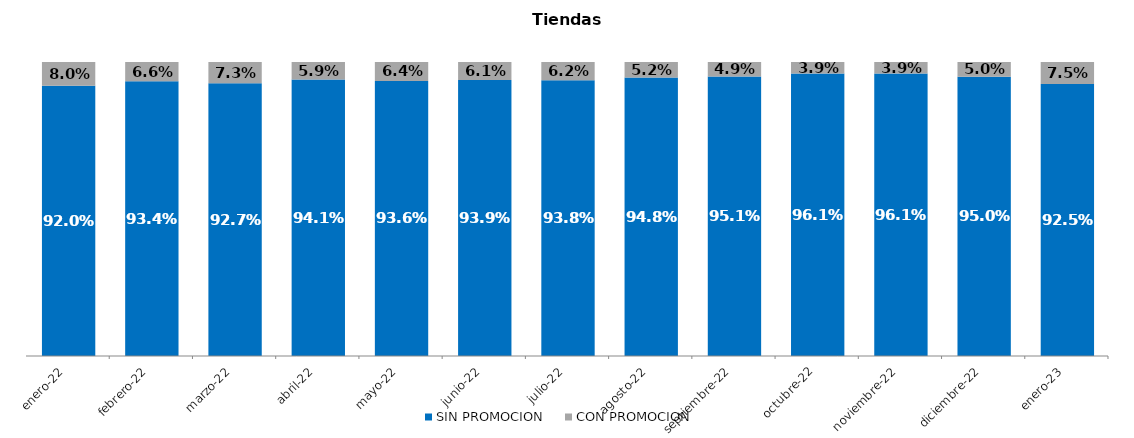
| Category | SIN PROMOCION   | CON PROMOCION   |
|---|---|---|
| 2022-01-01 | 0.92 | 0.08 |
| 2022-02-01 | 0.934 | 0.066 |
| 2022-03-01 | 0.927 | 0.073 |
| 2022-04-01 | 0.941 | 0.059 |
| 2022-05-01 | 0.936 | 0.064 |
| 2022-06-01 | 0.939 | 0.061 |
| 2022-07-01 | 0.938 | 0.062 |
| 2022-08-01 | 0.948 | 0.052 |
| 2022-09-01 | 0.951 | 0.049 |
| 2022-10-01 | 0.961 | 0.039 |
| 2022-11-01 | 0.961 | 0.039 |
| 2022-12-01 | 0.95 | 0.05 |
| 2023-01-01 | 0.925 | 0.075 |